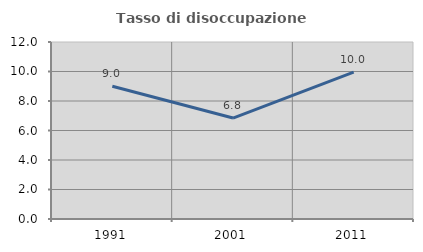
| Category | Tasso di disoccupazione giovanile  |
|---|---|
| 1991.0 | 8.996 |
| 2001.0 | 6.844 |
| 2011.0 | 9.953 |